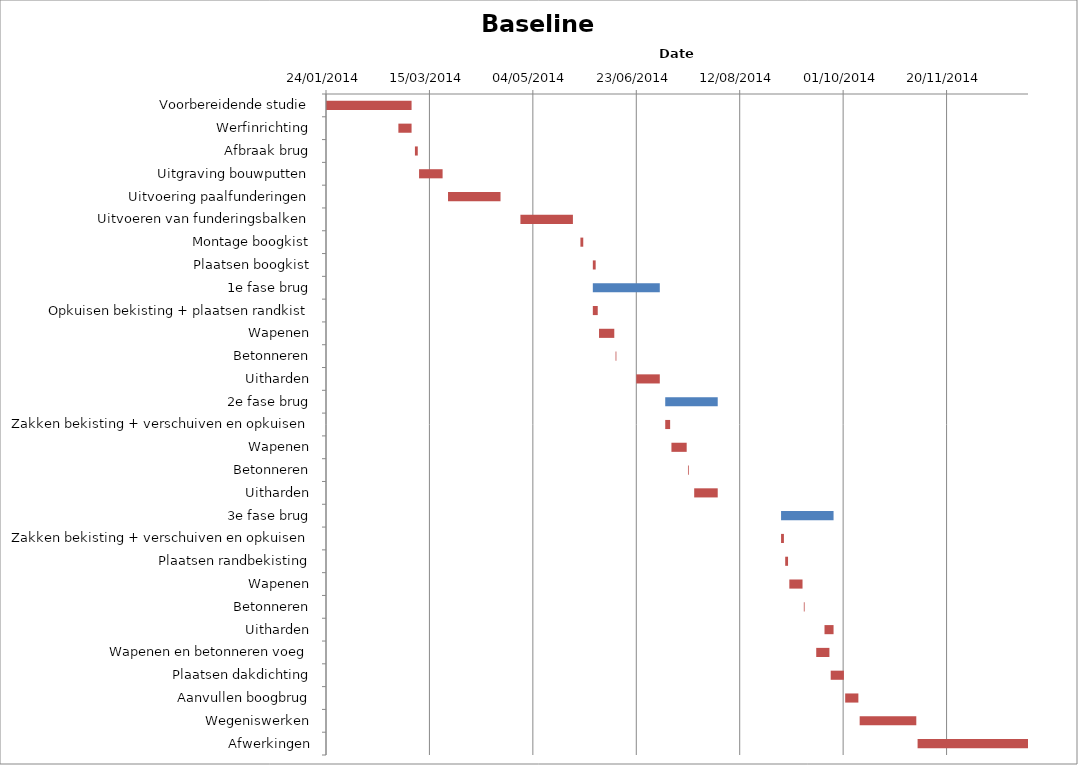
| Category | Baseline start | Actual duration |
|---|---|---|
| Voorbereidende studie | 41663.292 | 41.375 |
| Werfinrichting | 41698.292 | 6.375 |
| Afbraak brug | 41706.292 | 1.375 |
| Uitgraving bouwputten | 41708.292 | 11.375 |
| Uitvoering paalfunderingen | 41722.292 | 25.375 |
| Uitvoeren van funderingsbalken | 41757.292 | 25.375 |
| Montage boogkist | 41786.292 | 1.375 |
| Plaatsen boogkist | 41792.292 | 1.375 |
| 1e fase brug | 41792.292 | 32.375 |
| Opkuisen bekisting + plaatsen randkist | 41792.292 | 2.375 |
| Wapenen | 41795.292 | 7.375 |
| Betonneren | 41803.292 | 0.375 |
| Uitharden | 41813.292 | 11.375 |
| 2e fase brug | 41827.292 | 25.375 |
| Zakken bekisting + verschuiven en opkuisen | 41827.292 | 2.375 |
| Wapenen | 41830.292 | 7.375 |
| Betonneren | 41838.292 | 0.375 |
| Uitharden | 41841.292 | 11.375 |
| 3e fase brug | 41883.292 | 25.375 |
| Zakken bekisting + verschuiven en opkuisen | 41883.292 | 1.375 |
| Plaatsen randbekisting | 41885.292 | 1.375 |
| Wapenen | 41887.292 | 6.375 |
| Betonneren | 41894.292 | 0.375 |
| Uitharden | 41904.292 | 4.375 |
| Wapenen en betonneren voeg | 41900.292 | 6.375 |
| Plaatsen dakdichting | 41907.292 | 6.375 |
| Aanvullen boogbrug | 41914.292 | 6.375 |
| Wegeniswerken | 41921.292 | 27.375 |
| Afwerkingen | 41949.292 | 53.375 |